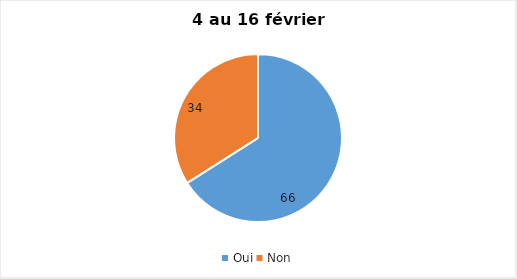
| Category | 4 au 16 février 2022 |
|---|---|
| Oui | 66 |
| Non | 34 |